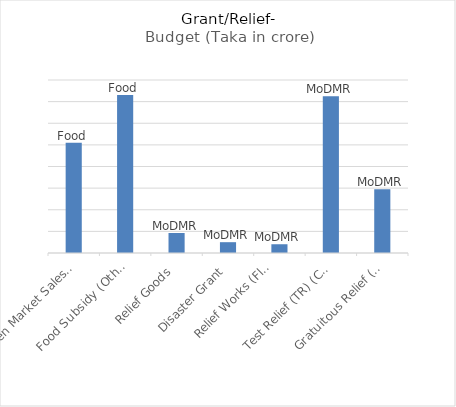
| Category | Budget (Taka in crore) |
|---|---|
| Open Market Sales (OMS) | 1019.86 |
| Food Subsidy (Others) | 1461.18 |
| Relief Goods | 185 |
| Disaster Grant | 100 |
| Relief Works (Flood, Drought,
Cyclone and Others) | 81 |
| Test Relief (TR) (Cash) | 1450 |
| Gratuitous Relief (Food) | 590.75 |